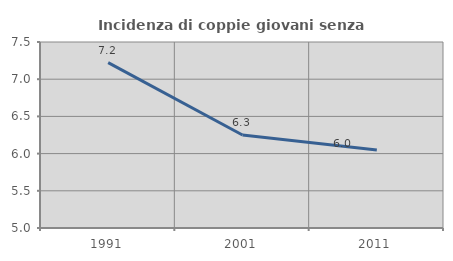
| Category | Incidenza di coppie giovani senza figli |
|---|---|
| 1991.0 | 7.222 |
| 2001.0 | 6.25 |
| 2011.0 | 6.048 |